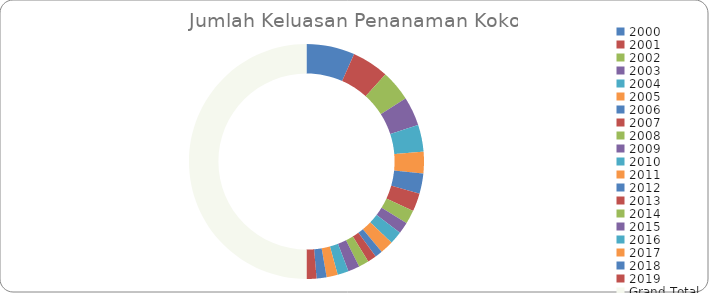
| Category | Sum of Jumlah Keluasan  |
|---|---|
| 2000 | 75766 |
| 2001 | 57963 |
| 2002 | 48631 |
| 2003 | 45493 |
| 2004 | 42208 |
| 2005 | 33994 |
| 2006 | 31740 |
| 2007 | 28459 |
| 2008 | 21411 |
| 2009 | 18047 |
| 2010 | 20083 |
| 2011 | 20848 |
| 2012 | 11748 |
| 2013 | 13826 |
| 2014 | 16102 |
| 2015 | 18122 |
| 2016 | 17421 |
| 2017 | 17563 |
| 2018 | 15661 |
| 2019 | 15661 |
| Grand Total | 570747 |